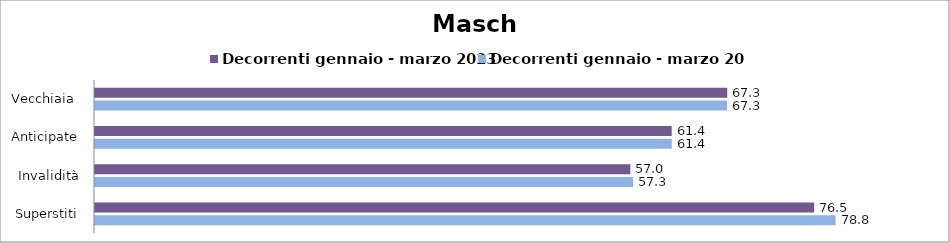
| Category | Decorrenti gennaio - marzo 2023 | Decorrenti gennaio - marzo 2024 |
|---|---|---|
| Vecchiaia  | 67.26 | 67.25 |
| Anticipate | 61.35 | 61.36 |
| Invalidità | 56.95 | 57.25 |
| Superstiti | 76.51 | 78.78 |